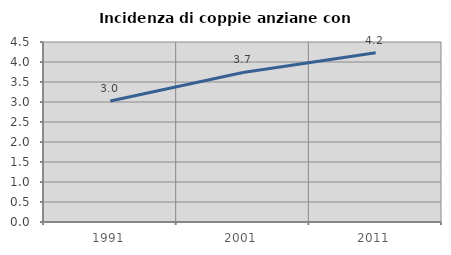
| Category | Incidenza di coppie anziane con figli |
|---|---|
| 1991.0 | 3.024 |
| 2001.0 | 3.738 |
| 2011.0 | 4.23 |